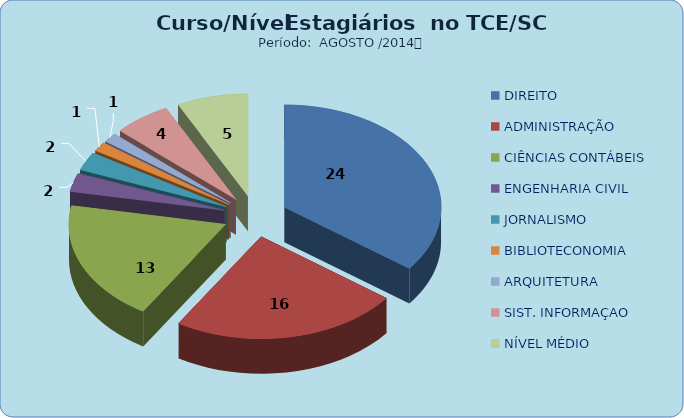
| Category | Series 0 |
|---|---|
| DIREITO | 24 |
| ADMINISTRAÇÃO | 16 |
| CIÊNCIAS CONTÁBEIS | 13 |
| ENGENHARIA CIVIL | 2 |
| JORNALISMO | 2 |
| BIBLIOTECONOMIA | 1 |
| ARQUITETURA | 1 |
| SIST. INFORMAÇAO | 4 |
| NÍVEL MÉDIO | 5 |